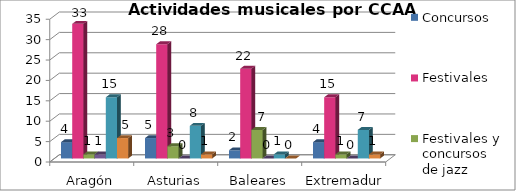
| Category | Concursos | Festivales | Festivales y concursos de jazz | Congresos y seminarios | Entidades convocantes, ayudas y becas |
|---|---|---|---|---|---|
| Aragón | 15 | 33 | 1 | 1 | 5 |
| Asturias | 8 | 28 | 3 | 0 | 1 |
| Baleares | 1 | 22 | 7 | 0 | 0 |
| Extremadura | 7 | 15 | 1 | 0 | 1 |